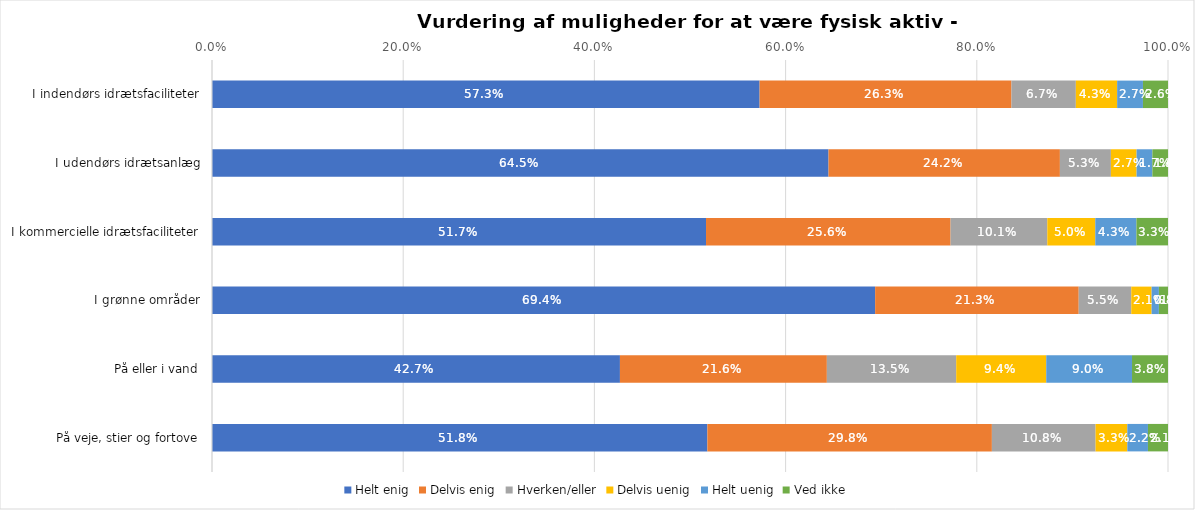
| Category | Helt enig | Delvis enig | Hverken/eller | Delvis uenig | Helt uenig | Ved ikke |
|---|---|---|---|---|---|---|
| I indendørs idrætsfaciliteter | 0.573 | 0.263 | 0.067 | 0.043 | 0.027 | 0.026 |
| I udendørs idrætsanlæg | 0.645 | 0.242 | 0.053 | 0.027 | 0.017 | 0.016 |
| I kommercielle idrætsfaciliteter | 0.517 | 0.256 | 0.101 | 0.05 | 0.043 | 0.033 |
| I grønne områder | 0.694 | 0.213 | 0.055 | 0.021 | 0.008 | 0.01 |
| På eller i vand | 0.427 | 0.216 | 0.135 | 0.094 | 0.09 | 0.038 |
| På veje, stier og fortove | 0.518 | 0.298 | 0.108 | 0.033 | 0.022 | 0.021 |